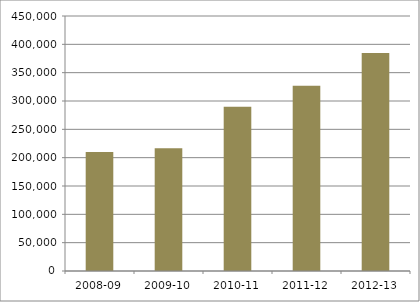
| Category | Coal mining |
|---|---|
| _x0007_2008-09 | 210000 |
| _x0007_2009-10 | 216810.138 |
| _x0007_2010-11 | 289907.919 |
| _x0007_2011-12 | 326837.137 |
| _x0007_2012-13 | 384874.768 |